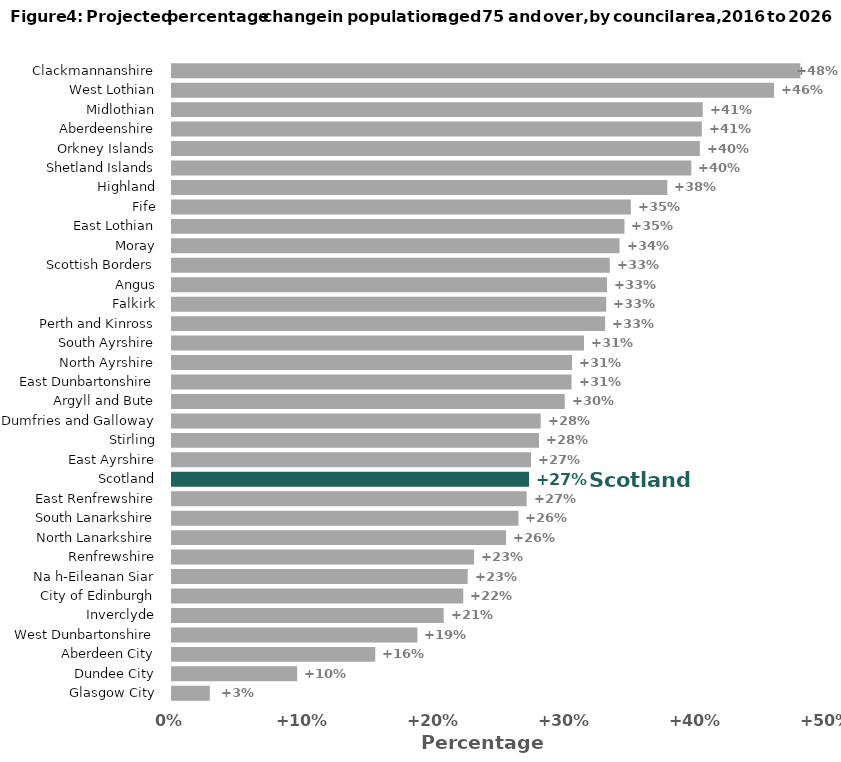
| Category | Series 0 |
|---|---|
| Glasgow City | 2.889 |
| Dundee City | 9.566 |
| Aberdeen City | 15.54 |
| West Dunbartonshire | 18.763 |
| Inverclyde | 20.773 |
| City of Edinburgh | 22.268 |
| Na h-Eileanan Siar | 22.608 |
| Renfrewshire | 23.099 |
| North Lanarkshire | 25.538 |
| South Lanarkshire | 26.489 |
| East Renfrewshire | 27.116 |
| Scotland | 27.293 |
| East Ayrshire | 27.447 |
| Stirling | 28.055 |
| Dumfries and Galloway | 28.185 |
| Argyll and Bute | 30.027 |
| East Dunbartonshire | 30.547 |
| North Ayrshire | 30.585 |
| South Ayrshire | 31.498 |
| Perth and Kinross | 33.115 |
| Falkirk | 33.195 |
| Angus | 33.254 |
| Scottish Borders | 33.472 |
| Moray | 34.216 |
| East Lothian | 34.591 |
| Fife | 35.079 |
| Highland | 37.866 |
| Shetland Islands | 39.705 |
| Orkney Islands | 40.355 |
| Aberdeenshire | 40.505 |
| Midlothian | 40.579 |
| West Lothian | 46.029 |
| Clackmannanshire | 48.04 |